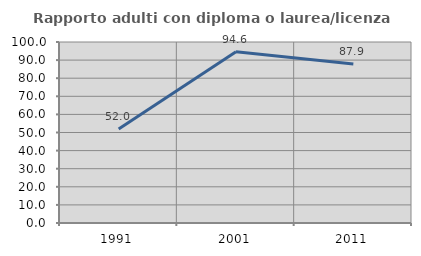
| Category | Rapporto adulti con diploma o laurea/licenza media  |
|---|---|
| 1991.0 | 51.991 |
| 2001.0 | 94.561 |
| 2011.0 | 87.868 |